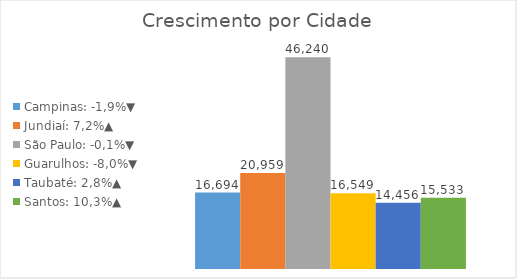
| Category | Campinas: -1,9%▼ | Jundiaí: 7,2%▲ | São Paulo: -0,1%▼ | Guarulhos: -8,0%▼ | Taubaté: 2,8%▲ | Santos: 10,3%▲ |
|---|---|---|---|---|---|---|
| 0 | 16694317 | 20959439 | 46240485 | 16549202 | 14455546 | 15533416 |